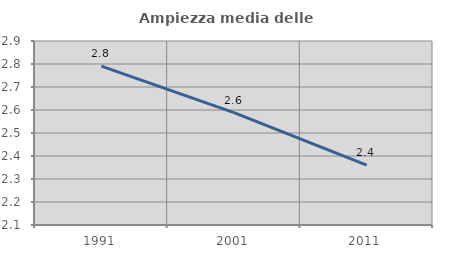
| Category | Ampiezza media delle famiglie |
|---|---|
| 1991.0 | 2.791 |
| 2001.0 | 2.589 |
| 2011.0 | 2.36 |